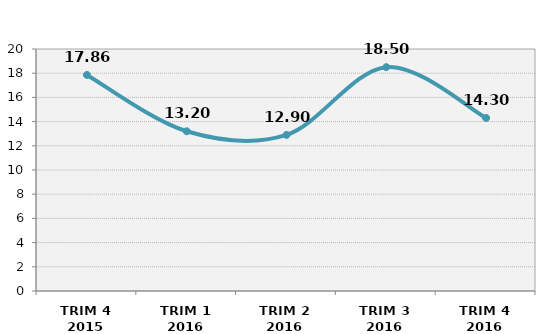
| Category | Volumen (Mio consumiciones) | Series 1 |
|---|---|---|
| TRIM 4 2015 | 17.856 |  |
| TRIM 1 2016 | 13.2 |  |
| TRIM 2 2016 | 12.9 |  |
| TRIM 3 2016 | 18.5 |  |
| TRIM 4 2016 | 14.3 |  |